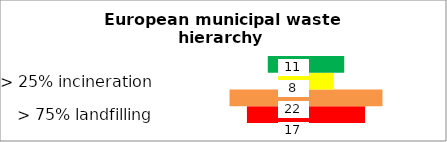
| Category | Series 0 | Series 1 |
|---|---|---|
| > 75% landfilling | -8.5 | 8.5 |
| > 50% landfilling | -11 | 11 |
| > 25% incineration | -4 | 4 |
| > 25% recycling | -5.5 | 5.5 |